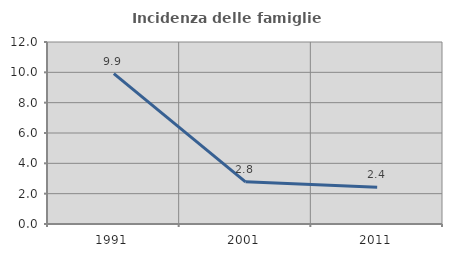
| Category | Incidenza delle famiglie numerose |
|---|---|
| 1991.0 | 9.917 |
| 2001.0 | 2.778 |
| 2011.0 | 2.421 |